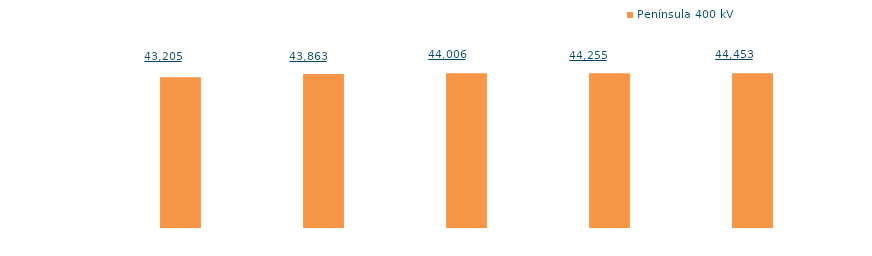
| Category | Península 400 kV |
|---|---|
| 2015 | 21180.747 |
| 2016 | 21615.889 |
| 2017 | 21724.85 |
| 2018 | 21726.61 |
| 2019 (1) | 21736.422 |